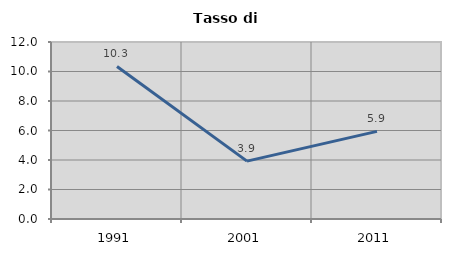
| Category | Tasso di disoccupazione   |
|---|---|
| 1991.0 | 10.344 |
| 2001.0 | 3.922 |
| 2011.0 | 5.942 |